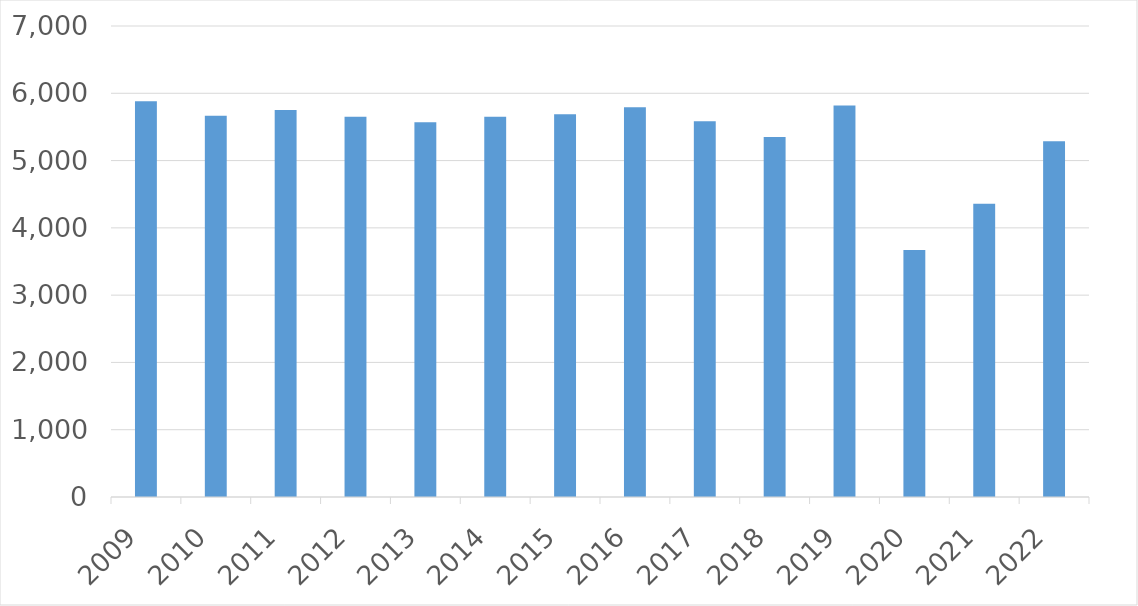
| Category | Series 0 |
|---|---|
| 2009 | 5880 |
| 2010 | 5667 |
| 2011 | 5752 |
| 2012 | 5650 |
| 2013 | 5569 |
| 2014 | 5651 |
| 2015 | 5689 |
| 2016 | 5792 |
| 2017 | 5584 |
| 2018 | 5349 |
| 2019 | 5819 |
| 2020 | 3671 |
| 2021 | 4358 |
| 2022 | 5287 |